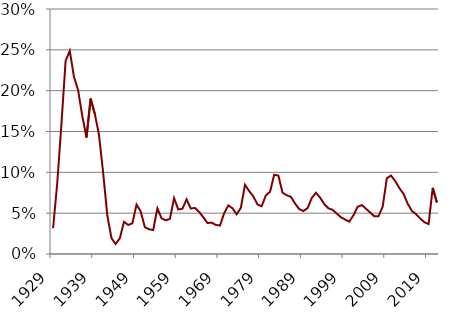
| Category | Series 0 |
|---|---|
| 1929.0 | 0.032 |
| 1930.0 | 0.087 |
| 1931.0 | 0.159 |
| 1932.0 | 0.236 |
| 1933.0 | 0.249 |
| 1934.0 | 0.217 |
| 1935.0 | 0.201 |
| 1936.0 | 0.169 |
| 1937.0 | 0.143 |
| 1938.0 | 0.19 |
| 1939.0 | 0.172 |
| 1940.0 | 0.146 |
| 1941.0 | 0.099 |
| 1942.0 | 0.047 |
| 1943.0 | 0.019 |
| 1944.0 | 0.012 |
| 1945.0 | 0.019 |
| 1946.0 | 0.039 |
| 1947.0 | 0.036 |
| 1948.0 | 0.038 |
| 1949.0 | 0.06 |
| 1950.0 | 0.052 |
| 1951.0 | 0.033 |
| 1952.0 | 0.03 |
| 1953.0 | 0.029 |
| 1954.0 | 0.056 |
| 1955.0 | 0.044 |
| 1956.0 | 0.041 |
| 1957.0 | 0.043 |
| 1958.0 | 0.068 |
| 1959.0 | 0.054 |
| 1960.0 | 0.055 |
| 1961.0 | 0.067 |
| 1962.0 | 0.056 |
| 1963.0 | 0.056 |
| 1964.0 | 0.052 |
| 1965.0 | 0.045 |
| 1966.0 | 0.038 |
| 1967.0 | 0.038 |
| 1968.0 | 0.036 |
| 1969.0 | 0.035 |
| 1970.0 | 0.05 |
| 1971.0 | 0.06 |
| 1972.0 | 0.056 |
| 1973.0 | 0.049 |
| 1974.0 | 0.056 |
| 1975.0 | 0.085 |
| 1976.0 | 0.077 |
| 1977.0 | 0.07 |
| 1978.0 | 0.061 |
| 1979.0 | 0.058 |
| 1980.0 | 0.072 |
| 1981.0 | 0.076 |
| 1982.0 | 0.097 |
| 1983.0 | 0.096 |
| 1984.0 | 0.075 |
| 1985.0 | 0.072 |
| 1986.0 | 0.07 |
| 1987.0 | 0.062 |
| 1988.0 | 0.055 |
| 1989.0 | 0.053 |
| 1990.0 | 0.056 |
| 1991.0 | 0.068 |
| 1992.0 | 0.075 |
| 1993.0 | 0.069 |
| 1994.0 | 0.061 |
| 1995.0 | 0.056 |
| 1996.0 | 0.054 |
| 1997.0 | 0.049 |
| 1998.0 | 0.045 |
| 1999.0 | 0.042 |
| 2000.0 | 0.04 |
| 2001.0 | 0.047 |
| 2002.0 | 0.058 |
| 2003.0 | 0.06 |
| 2004.0 | 0.055 |
| 2005.0 | 0.051 |
| 2006.0 | 0.046 |
| 2007.0 | 0.046 |
| 2008.0 | 0.058 |
| 2009.0 | 0.093 |
| 2010.0 | 0.096 |
| 2011.0 | 0.089 |
| 2012.0 | 0.081 |
| 2013.0 | 0.074 |
| 2014.0 | 0.062 |
| 2015.0 | 0.053 |
| 2016.0 | 0.049 |
| 2017.0 | 0.043 |
| 2018.0 | 0.039 |
| 2019.0 | 0.037 |
| 2020.0 | 0.081 |
| 2021.0 | 0.063 |